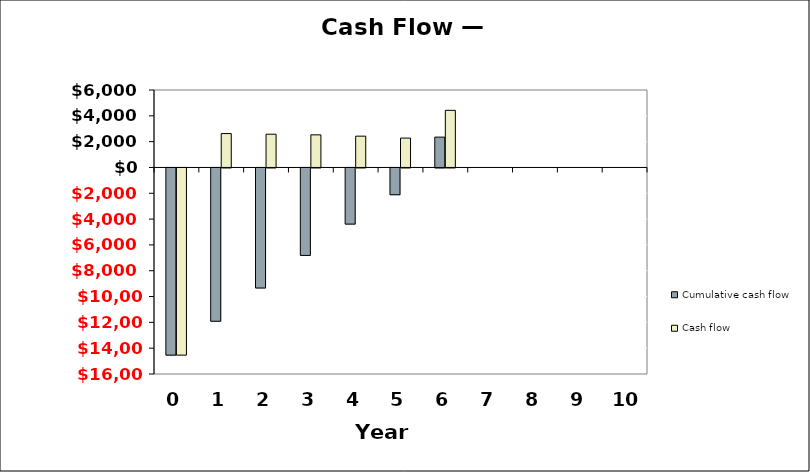
| Category | Cumulative cash flow | Cash flow |
|---|---|---|
| 0.0 | -14500 | -14500 |
| 1.0 | -11875 | 2625 |
| 2.0 | -9300 | 2575 |
| 3.0 | -6775 | 2525 |
| 4.0 | -4350 | 2425 |
| 5.0 | -2075 | 2275 |
| 6.0 | 2350 | 4425 |
| 7.0 | 0 | 0 |
| 8.0 | 0 | 0 |
| 9.0 | 0 | 0 |
| 10.0 | 0 | 0 |